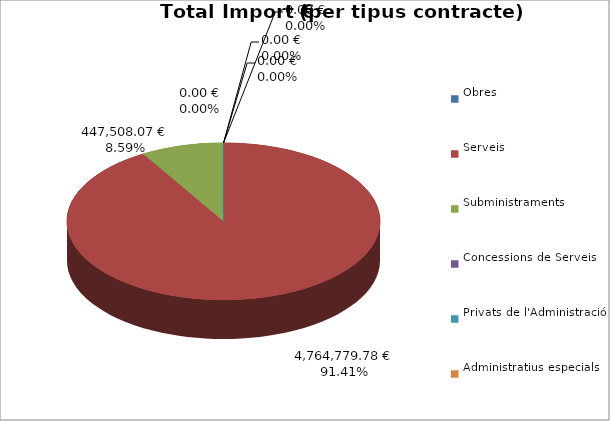
| Category | Total preu
(amb IVA) |
|---|---|
| Obres | 0 |
| Serveis | 4764779.784 |
| Subministraments | 447508.074 |
| Concessions de Serveis | 0 |
| Privats de l'Administració | 0 |
| Administratius especials | 0 |